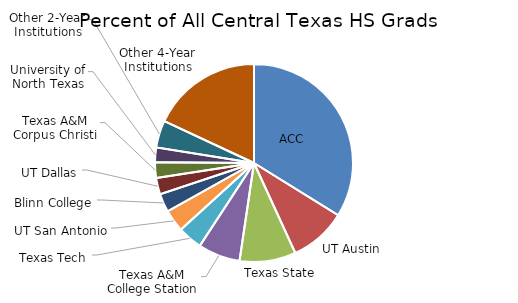
| Category | Percent of All |
|---|---|
| ACC | 0.338 |
| UT Austin | 0.093 |
| Texas State | 0.092 |
| Texas A&M College Station | 0.069 |
| Texas Tech | 0.04 |
| UT San Antonio | 0.036 |
| Blinn College | 0.03 |
| UT Dallas | 0.027 |
| Texas A&M Corpus Christi | 0.026 |
| University of North Texas | 0.024 |
| Other 2-Year Institutions | 0.044 |
| Other 4-Year Institutions | 0.181 |